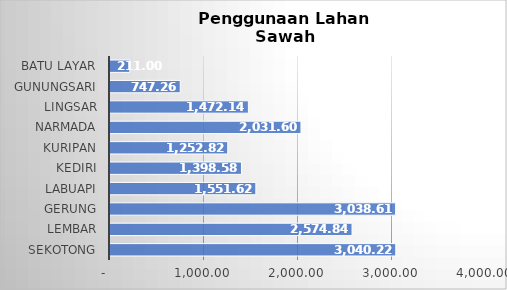
| Category | Series 0 |
|---|---|
| SEKOTONG | 3040.22 |
| LEMBAR | 2574.84 |
| GERUNG | 3038.61 |
| LABUAPI | 1551.62 |
|  KEDIRI | 1398.58 |
| KURIPAN | 1252.82 |
|  NARMADA | 2031.6 |
|  LINGSAR | 1472.14 |
|  GUNUNGSARI | 747.26 |
|  BATU LAYAR | 211 |